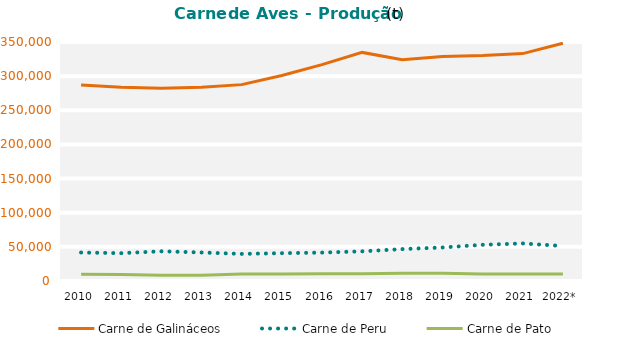
| Category | Carne de Galináceos | Carne de Peru | Carne de Pato |
|---|---|---|---|
| 2010 | 287084 | 41719 | 9835 |
| 2011 | 283758 | 40742 | 9364 |
| 2012 | 282279 | 43506 | 8303 |
| 2013 | 283803 | 41764 | 8489 |
| 2014 | 287574 | 39681 | 10211 |
| 2015 | 300897 | 40754 | 10189 |
| 2016 | 316877 | 41604 | 10660 |
| 2017 | 334753 | 43447 | 10573 |
| 2018 | 324124 | 46689 | 11332 |
| 2019 | 328826 | 49119 | 11265 |
| 2020 | 330085 | 52998.666 | 10305.309 |
| 2021 | 332992 | 55022.598 | 10419.864 |
| 2022* | 348271 | 51251.578 | 10298.114 |